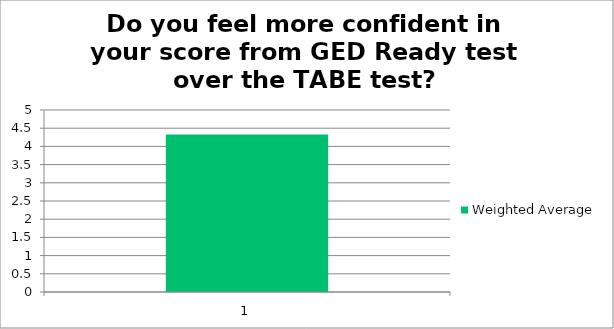
| Category | Weighted Average |
|---|---|
| 1.0 | 4.33 |